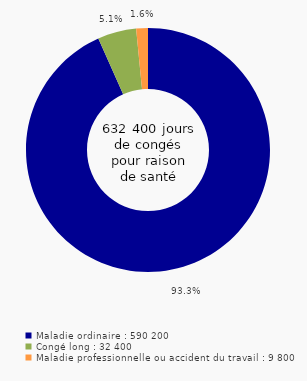
| Category | Series 0 |
|---|---|
| Maladie ordinaire : 590 200 | 0.933 |
| Congé long : 32 400 | 0.051 |
| Maladie professionnelle ou accident du travail : 9 800 | 0.016 |